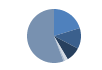
| Category | Series 0 |
|---|---|
| ARRASTRE | 267 |
| CERCO | 164 |
| PALANGRE | 116 |
| REDES DE ENMALLE | 24 |
| ARTES FIJAS | 12 |
| ARTES MENORES | 735 |